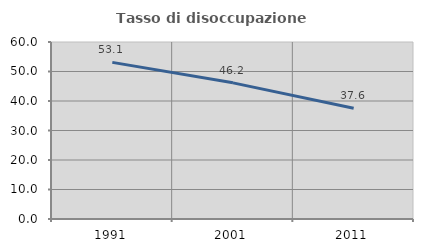
| Category | Tasso di disoccupazione giovanile  |
|---|---|
| 1991.0 | 53.099 |
| 2001.0 | 46.154 |
| 2011.0 | 37.569 |